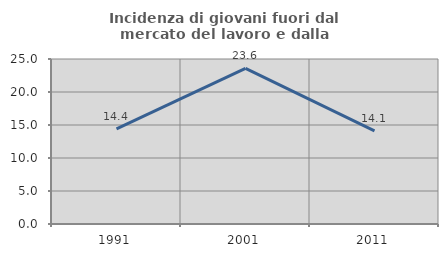
| Category | Incidenza di giovani fuori dal mercato del lavoro e dalla formazione  |
|---|---|
| 1991.0 | 14.397 |
| 2001.0 | 23.581 |
| 2011.0 | 14.116 |